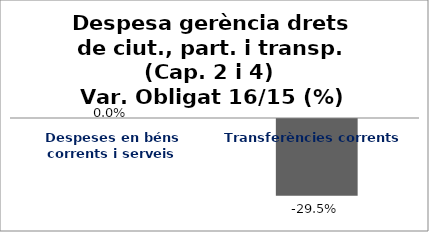
| Category | Series 0 |
|---|---|
| Despeses en béns corrents i serveis | 0 |
| Transferències corrents | -0.295 |